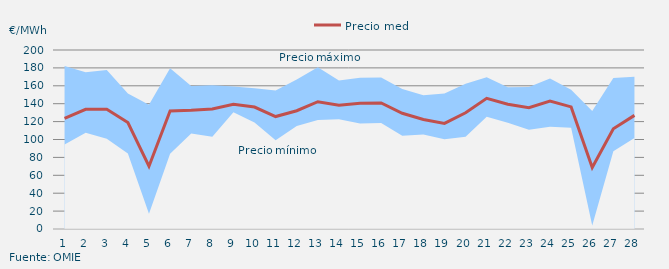
| Category | Precio medio |
|---|---|
| 1.0 | 123.691 |
| 2.0 | 133.778 |
| 3.0 | 133.855 |
| 4.0 | 118.918 |
| 5.0 | 70.103 |
| 6.0 | 131.853 |
| 7.0 | 132.627 |
| 8.0 | 133.986 |
| 9.0 | 139.459 |
| 10.0 | 136.268 |
| 11.0 | 125.643 |
| 12.0 | 132.128 |
| 13.0 | 142.228 |
| 14.0 | 138.215 |
| 15.0 | 140.511 |
| 16.0 | 140.781 |
| 17.0 | 129.296 |
| 18.0 | 122.348 |
| 19.0 | 117.937 |
| 20.0 | 129.903 |
| 21.0 | 145.946 |
| 22.0 | 139.458 |
| 23.0 | 135.463 |
| 24.0 | 142.948 |
| 25.0 | 136.411 |
| 26.0 | 68.644 |
| 27.0 | 111.961 |
| 28.0 | 126.944 |